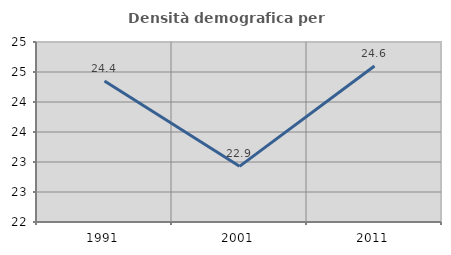
| Category | Densità demografica |
|---|---|
| 1991.0 | 24.35 |
| 2001.0 | 22.928 |
| 2011.0 | 24.601 |